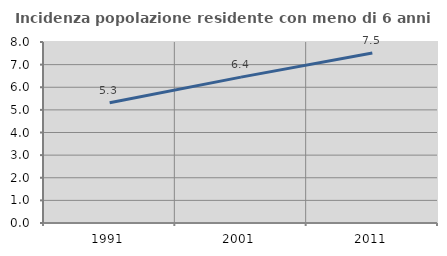
| Category | Incidenza popolazione residente con meno di 6 anni |
|---|---|
| 1991.0 | 5.312 |
| 2001.0 | 6.447 |
| 2011.0 | 7.51 |